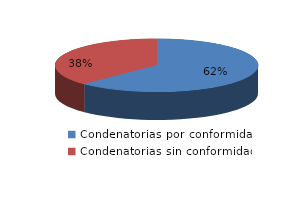
| Category | Series 0 |
|---|---|
| 0 | 8064 |
| 1 | 4840 |